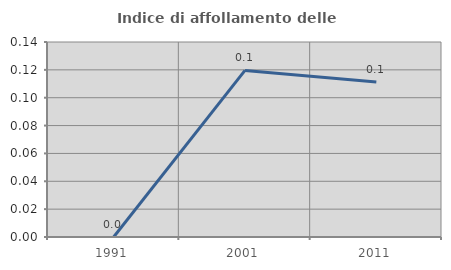
| Category | Indice di affollamento delle abitazioni  |
|---|---|
| 1991.0 | 0 |
| 2001.0 | 0.12 |
| 2011.0 | 0.111 |